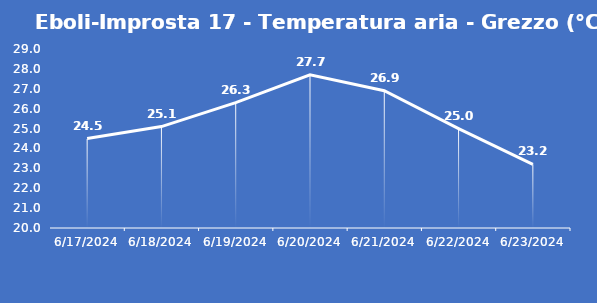
| Category | Eboli-Improsta 17 - Temperatura aria - Grezzo (°C) |
|---|---|
| 6/17/24 | 24.5 |
| 6/18/24 | 25.1 |
| 6/19/24 | 26.3 |
| 6/20/24 | 27.7 |
| 6/21/24 | 26.9 |
| 6/22/24 | 25 |
| 6/23/24 | 23.2 |